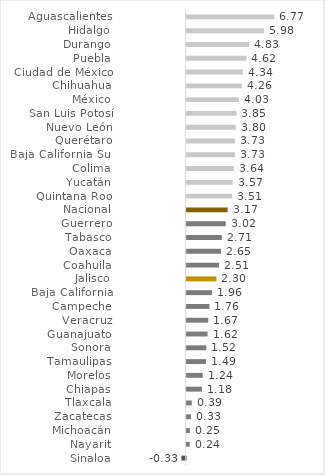
| Category | Series 0 |
|---|---|
| Sinaloa | -0.33 |
| Nayarit | 0.235 |
| Michoacán | 0.248 |
| Zacatecas | 0.329 |
| Tlaxcala | 0.394 |
| Chiapas | 1.182 |
| Morelos | 1.242 |
| Tamaulipas | 1.485 |
| Sonora | 1.518 |
| Guanajuato | 1.615 |
| Veracruz | 1.673 |
| Campeche | 1.759 |
| Baja California | 1.956 |
| Jalisco | 2.299 |
| Coahuila | 2.507 |
| Oaxaca | 2.653 |
| Tabasco | 2.713 |
| Guerrero | 3.02 |
| Nacional | 3.166 |
| Quintana Roo | 3.508 |
| Yucatán | 3.566 |
| Colima | 3.643 |
| Baja California Sur | 3.729 |
| Querétaro | 3.729 |
| Nuevo León | 3.799 |
| San Luis Potosí | 3.846 |
| México | 4.031 |
| Chihuahua | 4.265 |
| Ciudad de México | 4.339 |
| Puebla | 4.62 |
| Durango | 4.834 |
| Hidalgo | 5.979 |
| Aguascalientes | 6.769 |